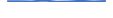
| Category | Series 0 |
|---|---|
| 0 | 4 |
| 1 | 4 |
| 2 | 3 |
| 3 | 8 |
| 4 | 1 |
| 5 | 3 |
| 6 | 6 |
| 7 | 2 |
| 8 | 5 |